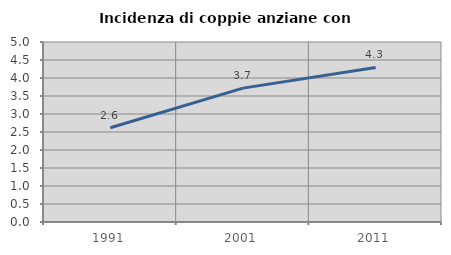
| Category | Incidenza di coppie anziane con figli |
|---|---|
| 1991.0 | 2.618 |
| 2001.0 | 3.719 |
| 2011.0 | 4.292 |